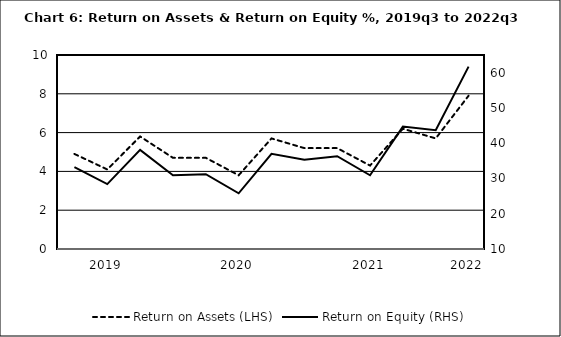
| Category | Return on Assets (LHS) |
|---|---|
| nan | 4.9 |
| 2019.0 | 4.1 |
| nan | 5.8 |
| nan | 4.7 |
| nan | 4.7 |
| 2020.0 | 3.8 |
| nan | 5.7 |
| nan | 5.2 |
| nan | 5.2 |
| 2021.0 | 4.3 |
| nan | 6.2 |
| nan | 5.7 |
| 2022.0 | 7.9 |